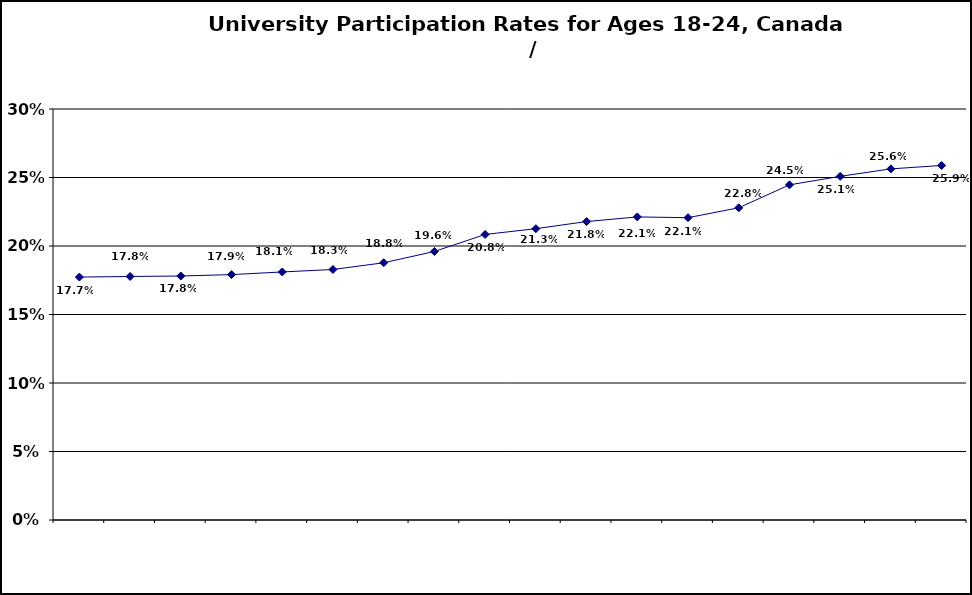
| Category | Series 0 |
|---|---|
|  | 0.177 |
|  | 0.178 |
|  | 0.178 |
|  | 0.179 |
|  | 0.181 |
|  | 0.183 |
|  | 0.188 |
|  | 0.196 |
|  | 0.208 |
|  | 0.213 |
|  | 0.218 |
|  | 0.221 |
|  | 0.221 |
|  | 0.228 |
|  | 0.245 |
|  | 0.251 |
|  | 0.256 |
|  | 0.259 |